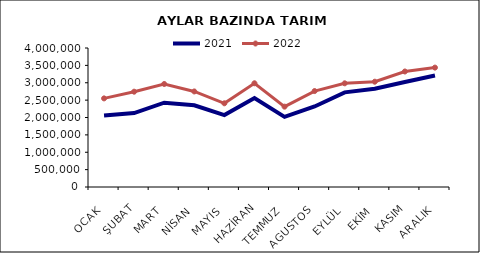
| Category | 2021 | 2022 |
|---|---|---|
| OCAK | 2058267.299 | 2550008.707 |
| ŞUBAT | 2127156.927 | 2742619.537 |
| MART | 2425908.127 | 2964259.154 |
| NİSAN | 2350522.597 | 2749441.48 |
| MAYIS | 2069723.539 | 2408561.561 |
| HAZİRAN | 2557481.684 | 2985037.347 |
| TEMMUZ | 2018139.021 | 2312107.971 |
| AGUSTOS | 2316954.456 | 2761230.124 |
| EYLÜL | 2723108.214 | 2983653.144 |
| EKİM | 2827417.476 | 3029888.802 |
| KASIM | 3021792.31 | 3323922.758 |
| ARALIK | 3209086.276 | 3435761.407 |